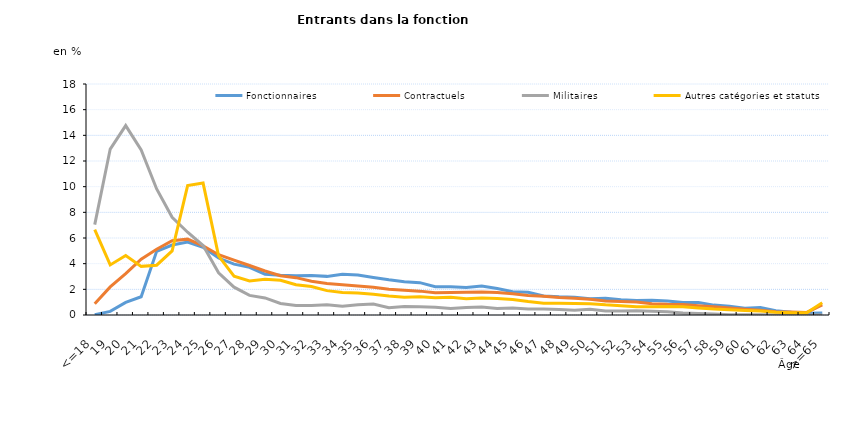
| Category | Fonctionnaires | Contractuels | Militaires | Autres catégories et statuts |
|---|---|---|---|---|
| <=18 | 0.03 | 0.88 | 7.04 | 6.65 |
| 19 | 0.28 | 2.19 | 12.93 | 3.9 |
| 20 | 0.98 | 3.22 | 14.76 | 4.63 |
| 21 | 1.42 | 4.35 | 12.86 | 3.79 |
| 22 | 4.96 | 5.12 | 9.82 | 3.88 |
| 23 | 5.45 | 5.79 | 7.61 | 4.99 |
| 24 | 5.69 | 5.91 | 6.45 | 10.08 |
| 25 | 5.27 | 5.38 | 5.41 | 10.28 |
| 26 | 4.44 | 4.7 | 3.29 | 4.61 |
| 27 | 3.96 | 4.27 | 2.17 | 3.02 |
| 28 | 3.72 | 3.86 | 1.53 | 2.65 |
| 29 | 3.18 | 3.43 | 1.33 | 2.78 |
| 30 | 3.1 | 3.06 | 0.9 | 2.71 |
| 31 | 3.06 | 2.91 | 0.74 | 2.36 |
| 32 | 3.07 | 2.63 | 0.74 | 2.22 |
| 33 | 3.01 | 2.45 | 0.8 | 1.9 |
| 34 | 3.18 | 2.36 | 0.68 | 1.76 |
| 35 | 3.12 | 2.26 | 0.8 | 1.71 |
| 36 | 2.93 | 2.17 | 0.86 | 1.62 |
| 37 | 2.75 | 2.01 | 0.57 | 1.48 |
| 38 | 2.6 | 1.93 | 0.67 | 1.38 |
| 39 | 2.52 | 1.86 | 0.64 | 1.42 |
| 40 | 2.21 | 1.74 | 0.61 | 1.34 |
| 41 | 2.21 | 1.76 | 0.5 | 1.38 |
| 42 | 2.14 | 1.77 | 0.59 | 1.27 |
| 43 | 2.26 | 1.8 | 0.62 | 1.32 |
| 44 | 2.06 | 1.75 | 0.51 | 1.28 |
| 45 | 1.82 | 1.66 | 0.54 | 1.21 |
| 46 | 1.77 | 1.52 | 0.46 | 1.05 |
| 47 | 1.48 | 1.46 | 0.46 | 0.92 |
| 48 | 1.42 | 1.37 | 0.42 | 0.91 |
| 49 | 1.39 | 1.31 | 0.37 | 0.89 |
| 50 | 1.27 | 1.22 | 0.44 | 0.88 |
| 51 | 1.31 | 1.1 | 0.31 | 0.79 |
| 52 | 1.19 | 1.05 | 0.32 | 0.73 |
| 53 | 1.13 | 1.01 | 0.34 | 0.65 |
| 54 | 1.15 | 0.88 | 0.29 | 0.64 |
| 55 | 1.1 | 0.83 | 0.26 | 0.67 |
| 56 | 0.98 | 0.82 | 0.15 | 0.64 |
| 57 | 0.98 | 0.73 | 0.12 | 0.55 |
| 58 | 0.77 | 0.64 | 0.07 | 0.46 |
| 59 | 0.69 | 0.55 | 0.01 | 0.4 |
| 60 | 0.52 | 0.45 | 0.01 | 0.35 |
| 61 | 0.58 | 0.37 | 0.01 | 0.31 |
| 62 | 0.33 | 0.26 | 0 | 0.21 |
| 63 | 0.21 | 0.23 | 0 | 0.18 |
| 64 | 0.14 | 0.2 | 0 | 0.17 |
| >=65 | 0.15 | 0.79 | 0 | 0.96 |